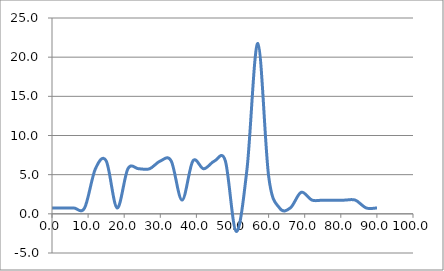
| Category | Elevation (in.) |
|---|---|
| 0.024 | 0.75 |
| 3.024 | 0.75 |
| 6.024 | 0.75 |
| 9.024000000000001 | 0.75 |
| 12.024000000000001 | 5.75 |
| 15.024000000000001 | 6.75 |
| 18.024 | 0.75 |
| 21.024 | 5.75 |
| 24.023999999999997 | 5.75 |
| 27.023999999999997 | 5.75 |
| 30.023999999999997 | 6.75 |
| 33.024 | 6.75 |
| 36.024 | 1.75 |
| 39.024 | 6.75 |
| 42.024 | 5.75 |
| 45.024 | 6.75 |
| 48.024 | 6.75 |
| 51.024 | -2.25 |
| 54.024 | 5.75 |
| 57.024 | 21.75 |
| 60.024 | 4.75 |
| 63.024 | 0.75 |
| 66.024 | 0.75 |
| 69.024 | 2.75 |
| 72.024 | 1.75 |
| 75.024 | 1.75 |
| 78.024 | 1.75 |
| 81.024 | 1.75 |
| 84.024 | 1.75 |
| 87.024 | 0.75 |
| 90.024 | 0.75 |